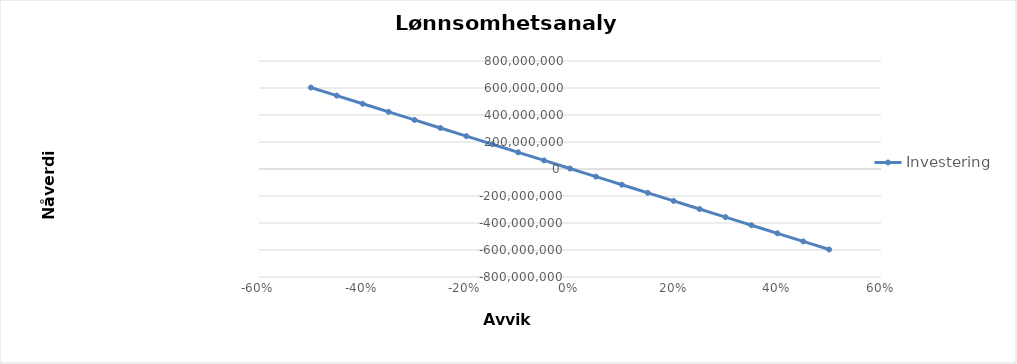
| Category | Investering |
|---|---|
| -0.5 | 603498819.159 |
| -0.45 | 543498819.159 |
| -0.4 | 483498819.159 |
| -0.35 | 423498819.159 |
| -0.3 | 363498819.159 |
| -0.25 | 303498819.159 |
| -0.2 | 243498819.159 |
| -0.15 | 183498819.159 |
| -0.1 | 123498819.159 |
| -0.05 | 63498819.159 |
| 0.0 | 3498819.159 |
| 0.05 | -56501180.841 |
| 0.1 | -116501180.841 |
| 0.15 | -176501180.841 |
| 0.2 | -236501180.841 |
| 0.25 | -296501180.841 |
| 0.3 | -356501180.841 |
| 0.35 | -416501180.841 |
| 0.4 | -476501180.841 |
| 0.45 | -536501180.841 |
| 0.5 | -596501180.841 |